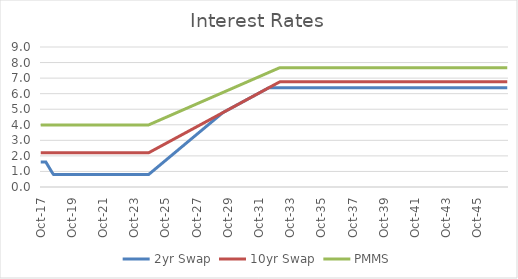
| Category | 2yr Swap | 10yr Swap | PMMS |
|---|---|---|---|
| 2017-10-31 | 1.604 | 2.197 | 3.99 |
| 2017-11-30 | 1.604 | 2.197 | 3.99 |
| 2017-12-31 | 1.604 | 2.197 | 3.99 |
| 2018-01-31 | 1.604 | 2.197 | 3.99 |
| 2018-02-28 | 1.604 | 2.197 | 3.99 |
| 2018-03-31 | 1.465 | 2.197 | 3.99 |
| 2018-04-30 | 1.325 | 2.197 | 3.99 |
| 2018-05-31 | 1.186 | 2.197 | 3.99 |
| 2018-06-30 | 1.047 | 2.197 | 3.99 |
| 2018-07-31 | 0.907 | 2.197 | 3.99 |
| 2018-08-31 | 0.798 | 2.197 | 3.99 |
| 2018-09-30 | 0.798 | 2.197 | 3.99 |
| 2018-10-31 | 0.798 | 2.197 | 3.99 |
| 2018-11-30 | 0.798 | 2.197 | 3.99 |
| 2018-12-31 | 0.798 | 2.197 | 3.99 |
| 2019-01-31 | 0.798 | 2.197 | 3.99 |
| 2019-02-28 | 0.798 | 2.197 | 3.99 |
| 2019-03-31 | 0.798 | 2.197 | 3.99 |
| 2019-04-30 | 0.798 | 2.197 | 3.99 |
| 2019-05-31 | 0.798 | 2.197 | 3.99 |
| 2019-06-30 | 0.798 | 2.197 | 3.99 |
| 2019-07-31 | 0.798 | 2.197 | 3.99 |
| 2019-08-31 | 0.798 | 2.197 | 3.99 |
| 2019-09-30 | 0.798 | 2.197 | 3.99 |
| 2019-10-31 | 0.798 | 2.197 | 3.99 |
| 2019-11-30 | 0.798 | 2.197 | 3.99 |
| 2019-12-31 | 0.798 | 2.197 | 3.99 |
| 2020-01-31 | 0.798 | 2.197 | 3.99 |
| 2020-02-29 | 0.798 | 2.197 | 3.99 |
| 2020-03-31 | 0.798 | 2.197 | 3.99 |
| 2020-04-30 | 0.798 | 2.197 | 3.99 |
| 2020-05-31 | 0.798 | 2.197 | 3.99 |
| 2020-06-30 | 0.798 | 2.197 | 3.99 |
| 2020-07-31 | 0.798 | 2.197 | 3.99 |
| 2020-08-31 | 0.798 | 2.197 | 3.99 |
| 2020-09-30 | 0.798 | 2.197 | 3.99 |
| 2020-10-31 | 0.798 | 2.197 | 3.99 |
| 2020-11-30 | 0.798 | 2.197 | 3.99 |
| 2020-12-31 | 0.798 | 2.197 | 3.99 |
| 2021-01-31 | 0.798 | 2.197 | 3.99 |
| 2021-02-28 | 0.798 | 2.197 | 3.99 |
| 2021-03-31 | 0.798 | 2.197 | 3.99 |
| 2021-04-30 | 0.798 | 2.197 | 3.99 |
| 2021-05-31 | 0.798 | 2.197 | 3.99 |
| 2021-06-30 | 0.798 | 2.197 | 3.99 |
| 2021-07-31 | 0.798 | 2.197 | 3.99 |
| 2021-08-31 | 0.798 | 2.197 | 3.99 |
| 2021-09-30 | 0.798 | 2.197 | 3.99 |
| 2021-10-31 | 0.798 | 2.197 | 3.99 |
| 2021-11-30 | 0.798 | 2.197 | 3.99 |
| 2021-12-31 | 0.798 | 2.197 | 3.99 |
| 2022-01-31 | 0.798 | 2.197 | 3.99 |
| 2022-02-28 | 0.798 | 2.197 | 3.99 |
| 2022-03-31 | 0.798 | 2.197 | 3.99 |
| 2022-04-30 | 0.798 | 2.197 | 3.99 |
| 2022-05-31 | 0.798 | 2.197 | 3.99 |
| 2022-06-30 | 0.798 | 2.197 | 3.99 |
| 2022-07-31 | 0.798 | 2.197 | 3.99 |
| 2022-08-31 | 0.798 | 2.197 | 3.99 |
| 2022-09-30 | 0.798 | 2.197 | 3.99 |
| 2022-10-31 | 0.798 | 2.197 | 3.99 |
| 2022-11-30 | 0.798 | 2.197 | 3.99 |
| 2022-12-31 | 0.798 | 2.197 | 3.99 |
| 2023-01-31 | 0.798 | 2.197 | 3.99 |
| 2023-02-28 | 0.798 | 2.197 | 3.99 |
| 2023-03-31 | 0.798 | 2.197 | 3.99 |
| 2023-04-30 | 0.798 | 2.197 | 3.99 |
| 2023-05-31 | 0.798 | 2.197 | 3.99 |
| 2023-06-30 | 0.798 | 2.197 | 3.99 |
| 2023-07-31 | 0.798 | 2.197 | 3.99 |
| 2023-08-31 | 0.798 | 2.197 | 3.99 |
| 2023-09-30 | 0.798 | 2.197 | 3.99 |
| 2023-10-31 | 0.798 | 2.197 | 3.99 |
| 2023-11-30 | 0.798 | 2.197 | 3.99 |
| 2023-12-31 | 0.798 | 2.197 | 3.99 |
| 2024-01-31 | 0.798 | 2.197 | 3.99 |
| 2024-02-29 | 0.798 | 2.197 | 3.99 |
| 2024-03-31 | 0.798 | 2.197 | 3.99 |
| 2024-04-30 | 0.798 | 2.197 | 3.99 |
| 2024-05-31 | 0.798 | 2.197 | 3.99 |
| 2024-06-30 | 0.798 | 2.197 | 3.99 |
| 2024-07-31 | 0.798 | 2.197 | 3.99 |
| 2024-08-31 | 0.798 | 2.197 | 3.99 |
| 2024-09-30 | 0.798 | 2.197 | 3.99 |
| 2024-10-31 | 0.868 | 2.242 | 4.026 |
| 2024-11-30 | 0.938 | 2.288 | 4.063 |
| 2024-12-31 | 1.007 | 2.333 | 4.099 |
| 2025-01-31 | 1.077 | 2.378 | 4.136 |
| 2025-02-28 | 1.147 | 2.423 | 4.172 |
| 2025-03-31 | 1.216 | 2.468 | 4.208 |
| 2025-04-30 | 1.286 | 2.514 | 4.245 |
| 2025-05-31 | 1.356 | 2.559 | 4.281 |
| 2025-06-30 | 1.425 | 2.604 | 4.318 |
| 2025-07-31 | 1.495 | 2.649 | 4.354 |
| 2025-08-31 | 1.565 | 2.695 | 4.391 |
| 2025-09-30 | 1.634 | 2.74 | 4.427 |
| 2025-10-31 | 1.704 | 2.785 | 4.464 |
| 2025-11-30 | 1.774 | 2.83 | 4.5 |
| 2025-12-31 | 1.843 | 2.875 | 4.537 |
| 2026-01-31 | 1.913 | 2.921 | 4.573 |
| 2026-02-28 | 1.983 | 2.966 | 4.61 |
| 2026-03-31 | 2.052 | 3.011 | 4.646 |
| 2026-04-30 | 2.122 | 3.056 | 4.683 |
| 2026-05-31 | 2.192 | 3.102 | 4.719 |
| 2026-06-30 | 2.261 | 3.147 | 4.756 |
| 2026-07-31 | 2.331 | 3.192 | 4.792 |
| 2026-08-31 | 2.401 | 3.237 | 4.829 |
| 2026-09-30 | 2.47 | 3.282 | 4.865 |
| 2026-10-31 | 2.54 | 3.328 | 4.902 |
| 2026-11-30 | 2.61 | 3.373 | 4.938 |
| 2026-12-31 | 2.679 | 3.418 | 4.975 |
| 2027-01-31 | 2.749 | 3.463 | 5.011 |
| 2027-02-28 | 2.819 | 3.508 | 5.048 |
| 2027-03-31 | 2.888 | 3.554 | 5.084 |
| 2027-04-30 | 2.958 | 3.599 | 5.12 |
| 2027-05-31 | 3.028 | 3.644 | 5.157 |
| 2027-06-30 | 3.097 | 3.689 | 5.193 |
| 2027-07-31 | 3.167 | 3.735 | 5.23 |
| 2027-08-31 | 3.237 | 3.78 | 5.266 |
| 2027-09-30 | 3.306 | 3.825 | 5.303 |
| 2027-10-31 | 3.376 | 3.87 | 5.339 |
| 2027-11-30 | 3.446 | 3.915 | 5.376 |
| 2027-12-31 | 3.515 | 3.961 | 5.412 |
| 2028-01-31 | 3.585 | 4.006 | 5.449 |
| 2028-02-29 | 3.655 | 4.051 | 5.485 |
| 2028-03-31 | 3.724 | 4.096 | 5.522 |
| 2028-04-30 | 3.794 | 4.142 | 5.558 |
| 2028-05-31 | 3.864 | 4.187 | 5.595 |
| 2028-06-30 | 3.933 | 4.232 | 5.631 |
| 2028-07-31 | 4.003 | 4.277 | 5.668 |
| 2028-08-31 | 4.073 | 4.322 | 5.704 |
| 2028-09-30 | 4.142 | 4.368 | 5.741 |
| 2028-10-31 | 4.212 | 4.413 | 5.777 |
| 2028-11-30 | 4.282 | 4.458 | 5.814 |
| 2028-12-31 | 4.351 | 4.503 | 5.85 |
| 2029-01-31 | 4.421 | 4.549 | 5.887 |
| 2029-02-28 | 4.491 | 4.594 | 5.923 |
| 2029-03-31 | 4.56 | 4.639 | 5.96 |
| 2029-04-30 | 4.63 | 4.684 | 5.996 |
| 2029-05-31 | 4.7 | 4.729 | 6.032 |
| 2029-06-30 | 4.769 | 4.775 | 6.069 |
| 2029-07-31 | 4.82 | 4.82 | 6.105 |
| 2029-08-31 | 4.865 | 4.865 | 6.142 |
| 2029-09-30 | 4.91 | 4.91 | 6.178 |
| 2029-10-31 | 4.956 | 4.956 | 6.215 |
| 2029-11-30 | 5.001 | 5.001 | 6.251 |
| 2029-12-31 | 5.046 | 5.046 | 6.288 |
| 2030-01-31 | 5.091 | 5.091 | 6.324 |
| 2030-02-28 | 5.136 | 5.136 | 6.361 |
| 2030-03-31 | 5.182 | 5.182 | 6.397 |
| 2030-04-30 | 5.227 | 5.227 | 6.434 |
| 2030-05-31 | 5.272 | 5.272 | 6.47 |
| 2030-06-30 | 5.317 | 5.317 | 6.507 |
| 2030-07-31 | 5.363 | 5.363 | 6.543 |
| 2030-08-31 | 5.408 | 5.408 | 6.579 |
| 2030-09-30 | 5.453 | 5.453 | 6.616 |
| 2030-10-31 | 5.498 | 5.498 | 6.652 |
| 2030-11-30 | 5.543 | 5.543 | 6.689 |
| 2030-12-31 | 5.589 | 5.589 | 6.725 |
| 2031-01-31 | 5.634 | 5.634 | 6.762 |
| 2031-02-28 | 5.679 | 5.679 | 6.798 |
| 2031-03-31 | 5.724 | 5.724 | 6.835 |
| 2031-04-30 | 5.77 | 5.77 | 6.871 |
| 2031-05-31 | 5.815 | 5.815 | 6.908 |
| 2031-06-30 | 5.86 | 5.86 | 6.944 |
| 2031-07-31 | 5.905 | 5.905 | 6.981 |
| 2031-08-31 | 5.95 | 5.95 | 7.017 |
| 2031-09-30 | 5.996 | 5.996 | 7.053 |
| 2031-10-31 | 6.041 | 6.041 | 7.09 |
| 2031-11-30 | 6.086 | 6.086 | 7.126 |
| 2031-12-31 | 6.131 | 6.131 | 7.163 |
| 2032-01-31 | 6.177 | 6.177 | 7.199 |
| 2032-02-29 | 6.222 | 6.222 | 7.236 |
| 2032-03-31 | 6.267 | 6.267 | 7.272 |
| 2032-04-30 | 6.312 | 6.312 | 7.309 |
| 2032-05-31 | 6.357 | 6.357 | 7.345 |
| 2032-06-30 | 6.387 | 6.403 | 7.382 |
| 2032-07-31 | 6.387 | 6.448 | 7.418 |
| 2032-08-31 | 6.387 | 6.493 | 7.454 |
| 2032-09-30 | 6.387 | 6.538 | 7.491 |
| 2032-10-31 | 6.387 | 6.583 | 7.527 |
| 2032-11-30 | 6.387 | 6.629 | 7.564 |
| 2032-12-31 | 6.387 | 6.674 | 7.6 |
| 2033-01-31 | 6.387 | 6.719 | 7.637 |
| 2033-02-28 | 6.387 | 6.758 | 7.668 |
| 2033-03-31 | 6.387 | 6.758 | 7.668 |
| 2033-04-30 | 6.387 | 6.758 | 7.668 |
| 2033-05-31 | 6.387 | 6.758 | 7.668 |
| 2033-06-30 | 6.387 | 6.758 | 7.668 |
| 2033-07-31 | 6.387 | 6.758 | 7.668 |
| 2033-08-31 | 6.387 | 6.758 | 7.668 |
| 2033-09-30 | 6.387 | 6.758 | 7.668 |
| 2033-10-31 | 6.387 | 6.758 | 7.668 |
| 2033-11-30 | 6.387 | 6.758 | 7.668 |
| 2033-12-31 | 6.387 | 6.758 | 7.668 |
| 2034-01-31 | 6.387 | 6.758 | 7.668 |
| 2034-02-28 | 6.387 | 6.758 | 7.668 |
| 2034-03-31 | 6.387 | 6.758 | 7.668 |
| 2034-04-30 | 6.387 | 6.758 | 7.668 |
| 2034-05-31 | 6.387 | 6.758 | 7.668 |
| 2034-06-30 | 6.387 | 6.758 | 7.668 |
| 2034-07-31 | 6.387 | 6.758 | 7.668 |
| 2034-08-31 | 6.387 | 6.758 | 7.668 |
| 2034-09-30 | 6.387 | 6.758 | 7.668 |
| 2034-10-31 | 6.387 | 6.758 | 7.668 |
| 2034-11-30 | 6.387 | 6.758 | 7.668 |
| 2034-12-31 | 6.387 | 6.758 | 7.668 |
| 2035-01-31 | 6.387 | 6.758 | 7.668 |
| 2035-02-28 | 6.387 | 6.758 | 7.668 |
| 2035-03-31 | 6.387 | 6.758 | 7.668 |
| 2035-04-30 | 6.387 | 6.758 | 7.668 |
| 2035-05-31 | 6.387 | 6.758 | 7.668 |
| 2035-06-30 | 6.387 | 6.758 | 7.668 |
| 2035-07-31 | 6.387 | 6.758 | 7.668 |
| 2035-08-31 | 6.387 | 6.758 | 7.668 |
| 2035-09-30 | 6.387 | 6.758 | 7.668 |
| 2035-10-31 | 6.387 | 6.758 | 7.668 |
| 2035-11-30 | 6.387 | 6.758 | 7.668 |
| 2035-12-31 | 6.387 | 6.758 | 7.668 |
| 2036-01-31 | 6.387 | 6.758 | 7.668 |
| 2036-02-29 | 6.387 | 6.758 | 7.668 |
| 2036-03-31 | 6.387 | 6.758 | 7.668 |
| 2036-04-30 | 6.387 | 6.758 | 7.668 |
| 2036-05-31 | 6.387 | 6.758 | 7.668 |
| 2036-06-30 | 6.387 | 6.758 | 7.668 |
| 2036-07-31 | 6.387 | 6.758 | 7.668 |
| 2036-08-31 | 6.387 | 6.758 | 7.668 |
| 2036-09-30 | 6.387 | 6.758 | 7.668 |
| 2036-10-31 | 6.387 | 6.758 | 7.668 |
| 2036-11-30 | 6.387 | 6.758 | 7.668 |
| 2036-12-31 | 6.387 | 6.758 | 7.668 |
| 2037-01-31 | 6.387 | 6.758 | 7.668 |
| 2037-02-28 | 6.387 | 6.758 | 7.668 |
| 2037-03-31 | 6.387 | 6.758 | 7.668 |
| 2037-04-30 | 6.387 | 6.758 | 7.668 |
| 2037-05-31 | 6.387 | 6.758 | 7.668 |
| 2037-06-30 | 6.387 | 6.758 | 7.668 |
| 2037-07-31 | 6.387 | 6.758 | 7.668 |
| 2037-08-31 | 6.387 | 6.758 | 7.668 |
| 2037-09-30 | 6.387 | 6.758 | 7.668 |
| 2037-10-31 | 6.387 | 6.758 | 7.668 |
| 2037-11-30 | 6.387 | 6.758 | 7.668 |
| 2037-12-31 | 6.387 | 6.758 | 7.668 |
| 2038-01-31 | 6.387 | 6.758 | 7.668 |
| 2038-02-28 | 6.387 | 6.758 | 7.668 |
| 2038-03-31 | 6.387 | 6.758 | 7.668 |
| 2038-04-30 | 6.387 | 6.758 | 7.668 |
| 2038-05-31 | 6.387 | 6.758 | 7.668 |
| 2038-06-30 | 6.387 | 6.758 | 7.668 |
| 2038-07-31 | 6.387 | 6.758 | 7.668 |
| 2038-08-31 | 6.387 | 6.758 | 7.668 |
| 2038-09-30 | 6.387 | 6.758 | 7.668 |
| 2038-10-31 | 6.387 | 6.758 | 7.668 |
| 2038-11-30 | 6.387 | 6.758 | 7.668 |
| 2038-12-31 | 6.387 | 6.758 | 7.668 |
| 2039-01-31 | 6.387 | 6.758 | 7.668 |
| 2039-02-28 | 6.387 | 6.758 | 7.668 |
| 2039-03-31 | 6.387 | 6.758 | 7.668 |
| 2039-04-30 | 6.387 | 6.758 | 7.668 |
| 2039-05-31 | 6.387 | 6.758 | 7.668 |
| 2039-06-30 | 6.387 | 6.758 | 7.668 |
| 2039-07-31 | 6.387 | 6.758 | 7.668 |
| 2039-08-31 | 6.387 | 6.758 | 7.668 |
| 2039-09-30 | 6.387 | 6.758 | 7.668 |
| 2039-10-31 | 6.387 | 6.758 | 7.668 |
| 2039-11-30 | 6.387 | 6.758 | 7.668 |
| 2039-12-31 | 6.387 | 6.758 | 7.668 |
| 2040-01-31 | 6.387 | 6.758 | 7.668 |
| 2040-02-29 | 6.387 | 6.758 | 7.668 |
| 2040-03-31 | 6.387 | 6.758 | 7.668 |
| 2040-04-30 | 6.387 | 6.758 | 7.668 |
| 2040-05-31 | 6.387 | 6.758 | 7.668 |
| 2040-06-30 | 6.387 | 6.758 | 7.668 |
| 2040-07-31 | 6.387 | 6.758 | 7.668 |
| 2040-08-31 | 6.387 | 6.758 | 7.668 |
| 2040-09-30 | 6.387 | 6.758 | 7.668 |
| 2040-10-31 | 6.387 | 6.758 | 7.668 |
| 2040-11-30 | 6.387 | 6.758 | 7.668 |
| 2040-12-31 | 6.387 | 6.758 | 7.668 |
| 2041-01-31 | 6.387 | 6.758 | 7.668 |
| 2041-02-28 | 6.387 | 6.758 | 7.668 |
| 2041-03-31 | 6.387 | 6.758 | 7.668 |
| 2041-04-30 | 6.387 | 6.758 | 7.668 |
| 2041-05-31 | 6.387 | 6.758 | 7.668 |
| 2041-06-30 | 6.387 | 6.758 | 7.668 |
| 2041-07-31 | 6.387 | 6.758 | 7.668 |
| 2041-08-31 | 6.387 | 6.758 | 7.668 |
| 2041-09-30 | 6.387 | 6.758 | 7.668 |
| 2041-10-31 | 6.387 | 6.758 | 7.668 |
| 2041-11-30 | 6.387 | 6.758 | 7.668 |
| 2041-12-31 | 6.387 | 6.758 | 7.668 |
| 2042-01-31 | 6.387 | 6.758 | 7.668 |
| 2042-02-28 | 6.387 | 6.758 | 7.668 |
| 2042-03-31 | 6.387 | 6.758 | 7.668 |
| 2042-04-30 | 6.387 | 6.758 | 7.668 |
| 2042-05-31 | 6.387 | 6.758 | 7.668 |
| 2042-06-30 | 6.387 | 6.758 | 7.668 |
| 2042-07-31 | 6.387 | 6.758 | 7.668 |
| 2042-08-31 | 6.387 | 6.758 | 7.668 |
| 2042-09-30 | 6.387 | 6.758 | 7.668 |
| 2042-10-31 | 6.387 | 6.758 | 7.668 |
| 2042-11-30 | 6.387 | 6.758 | 7.668 |
| 2042-12-31 | 6.387 | 6.758 | 7.668 |
| 2043-01-31 | 6.387 | 6.758 | 7.668 |
| 2043-02-28 | 6.387 | 6.758 | 7.668 |
| 2043-03-31 | 6.387 | 6.758 | 7.668 |
| 2043-04-30 | 6.387 | 6.758 | 7.668 |
| 2043-05-31 | 6.387 | 6.758 | 7.668 |
| 2043-06-30 | 6.387 | 6.758 | 7.668 |
| 2043-07-31 | 6.387 | 6.758 | 7.668 |
| 2043-08-31 | 6.387 | 6.758 | 7.668 |
| 2043-09-30 | 6.387 | 6.758 | 7.668 |
| 2043-10-31 | 6.387 | 6.758 | 7.668 |
| 2043-11-30 | 6.387 | 6.758 | 7.668 |
| 2043-12-31 | 6.387 | 6.758 | 7.668 |
| 2044-01-31 | 6.387 | 6.758 | 7.668 |
| 2044-02-29 | 6.387 | 6.758 | 7.668 |
| 2044-03-31 | 6.387 | 6.758 | 7.668 |
| 2044-04-30 | 6.387 | 6.758 | 7.668 |
| 2044-05-31 | 6.387 | 6.758 | 7.668 |
| 2044-06-30 | 6.387 | 6.758 | 7.668 |
| 2044-07-31 | 6.387 | 6.758 | 7.668 |
| 2044-08-31 | 6.387 | 6.758 | 7.668 |
| 2044-09-30 | 6.387 | 6.758 | 7.668 |
| 2044-10-31 | 6.387 | 6.758 | 7.668 |
| 2044-11-30 | 6.387 | 6.758 | 7.668 |
| 2044-12-31 | 6.387 | 6.758 | 7.668 |
| 2045-01-31 | 6.387 | 6.758 | 7.668 |
| 2045-02-28 | 6.387 | 6.758 | 7.668 |
| 2045-03-31 | 6.387 | 6.758 | 7.668 |
| 2045-04-30 | 6.387 | 6.758 | 7.668 |
| 2045-05-31 | 6.387 | 6.758 | 7.668 |
| 2045-06-30 | 6.387 | 6.758 | 7.668 |
| 2045-07-31 | 6.387 | 6.758 | 7.668 |
| 2045-08-31 | 6.387 | 6.758 | 7.668 |
| 2045-09-30 | 6.387 | 6.758 | 7.668 |
| 2045-10-31 | 6.387 | 6.758 | 7.668 |
| 2045-11-30 | 6.387 | 6.758 | 7.668 |
| 2045-12-31 | 6.387 | 6.758 | 7.668 |
| 2046-01-31 | 6.387 | 6.758 | 7.668 |
| 2046-02-28 | 6.387 | 6.758 | 7.668 |
| 2046-03-31 | 6.387 | 6.758 | 7.668 |
| 2046-04-30 | 6.387 | 6.758 | 7.668 |
| 2046-05-31 | 6.387 | 6.758 | 7.668 |
| 2046-06-30 | 6.387 | 6.758 | 7.668 |
| 2046-07-31 | 6.387 | 6.758 | 7.668 |
| 2046-08-31 | 6.387 | 6.758 | 7.668 |
| 2046-09-30 | 6.387 | 6.758 | 7.668 |
| 2046-10-31 | 6.387 | 6.758 | 7.668 |
| 2046-11-30 | 6.387 | 6.758 | 7.668 |
| 2046-12-31 | 6.387 | 6.758 | 7.668 |
| 2047-01-31 | 6.387 | 6.758 | 7.668 |
| 2047-02-28 | 6.387 | 6.758 | 7.668 |
| 2047-03-31 | 6.387 | 6.758 | 7.668 |
| 2047-04-30 | 6.387 | 6.758 | 7.668 |
| 2047-05-31 | 6.387 | 6.758 | 7.668 |
| 2047-06-30 | 6.387 | 6.758 | 7.668 |
| 2047-07-31 | 6.387 | 6.758 | 7.668 |
| 2047-08-31 | 6.387 | 6.758 | 7.668 |
| 2047-09-30 | 6.387 | 6.758 | 7.668 |